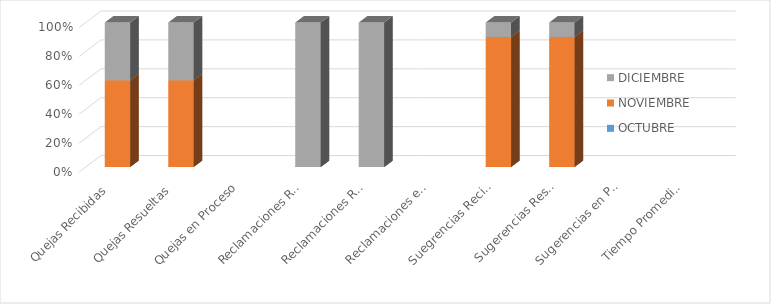
| Category | OCTUBRE | NOVIEMBRE | DICIEMBRE |
|---|---|---|---|
| Quejas Recibidas | 0 | 3 | 2 |
| Quejas Resueltas | 0 | 3 | 2 |
| Quejas en Proceso | 0 | 0 | 0 |
| Reclamaciones Recibidas | 0 | 0 | 1 |
| Reclamaciones Resueltas | 0 | 0 | 1 |
| Reclamaciones en Proceso | 0 | 0 | 0 |
| Suegrencias Recibidas | 0 | 9 | 1 |
| Sugerencias Resueltas | 0 | 9 | 1 |
| Sugerencias en Proceso | 0 | 0 | 0 |
| Tiempo Promedio en que fueron Respondidas | 0 | 0 | 0 |